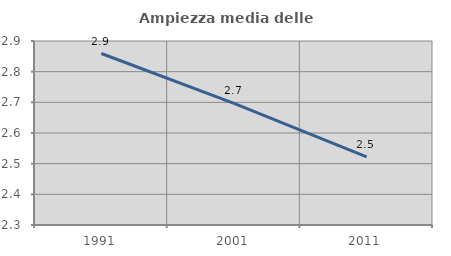
| Category | Ampiezza media delle famiglie |
|---|---|
| 1991.0 | 2.859 |
| 2001.0 | 2.696 |
| 2011.0 | 2.522 |